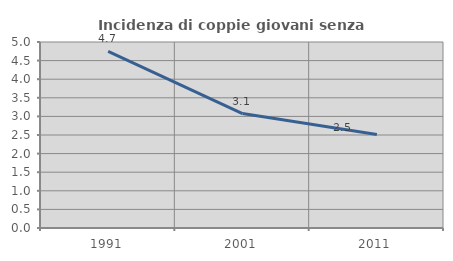
| Category | Incidenza di coppie giovani senza figli |
|---|---|
| 1991.0 | 4.748 |
| 2001.0 | 3.077 |
| 2011.0 | 2.516 |